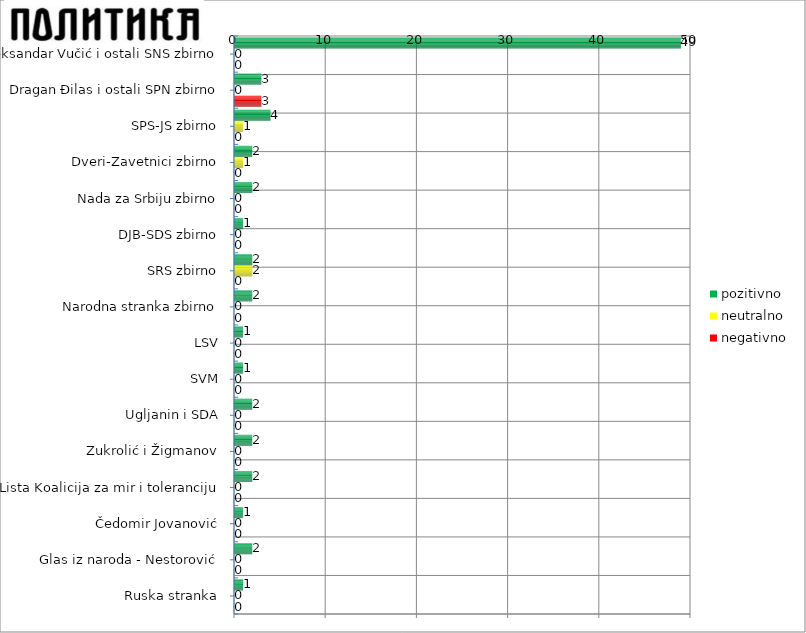
| Category | pozitivno | neutralno | negativno |
|---|---|---|---|
| Aleksandar Vučić i ostali SNS zbirno | 49 | 0 | 0 |
| Dragan Đilas i ostali SPN zbirno | 3 | 0 | 3 |
| SPS-JS zbirno | 4 | 1 | 0 |
| Dveri-Zavetnici zbirno | 2 | 1 | 0 |
| Nada za Srbiju zbirno | 2 | 0 | 0 |
| DJB-SDS zbirno | 1 | 0 | 0 |
| SRS zbirno | 2 | 2 | 0 |
| Narodna stranka zbirno | 2 | 0 | 0 |
| LSV | 1 | 0 | 0 |
| SVM | 1 | 0 | 0 |
| Ugljanin i SDA | 2 | 0 | 0 |
| Zukrolić i Žigmanov | 2 | 0 | 0 |
| Lista Koalicija za mir i toleranciju | 2 | 0 | 0 |
| Čedomir Jovanović | 1 | 0 | 0 |
| Glas iz naroda - Nestorović | 2 | 0 | 0 |
| Ruska stranka | 1 | 0 | 0 |